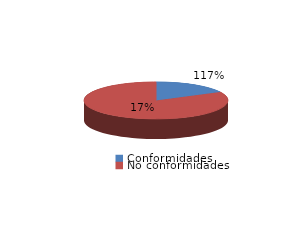
| Category | Series 0 |
|---|---|
| Conformidades | 168 |
| No conformidades | -25 |